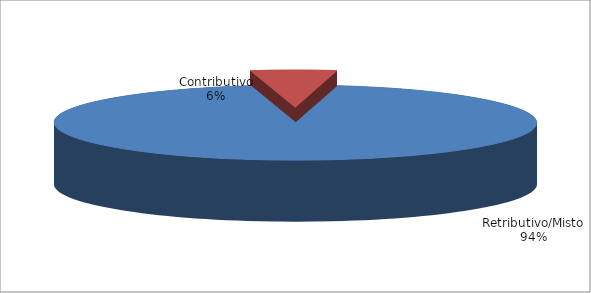
| Category | serie2 |
|---|---|
| Retributivo/Misto | 66344 |
| Contributivo | 4048 |